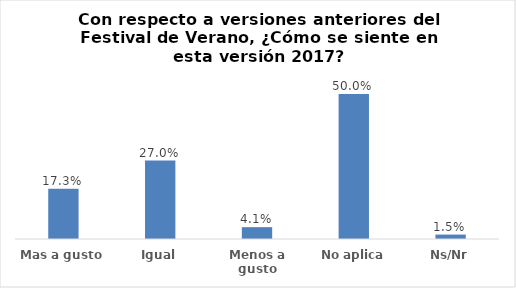
| Category | Series 0 |
|---|---|
| Mas a gusto | 0.173 |
| Igual | 0.27 |
| Menos a gusto | 0.041 |
| No aplica | 0.5 |
| Ns/Nr | 0.015 |